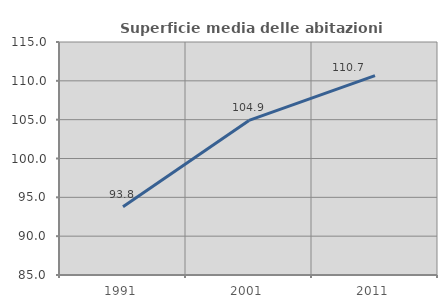
| Category | Superficie media delle abitazioni occupate |
|---|---|
| 1991.0 | 93.792 |
| 2001.0 | 104.906 |
| 2011.0 | 110.673 |